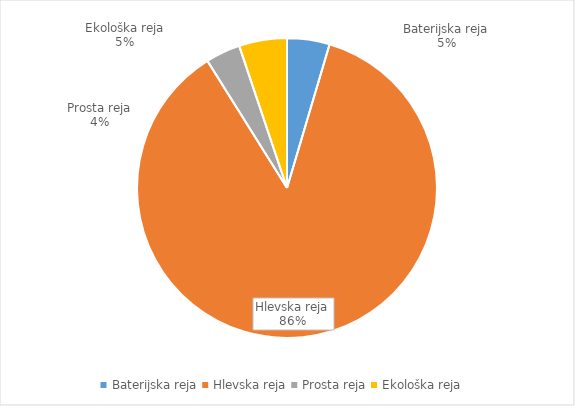
| Category | Količina kosov jajc |
|---|---|
| Baterijska reja | 109970 |
| Hlevska reja | 2074458 |
| Prosta reja | 89705 |
| Ekološka reja | 123800 |